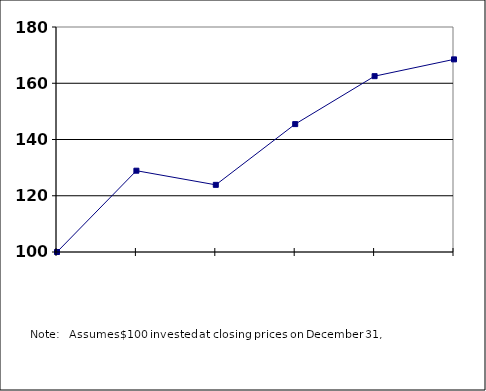
| Category |  100.00  |
|---|---|
| nan | 100 |
| 2014.0 | 128.91 |
| 2015.0 | 123.877 |
| 2016.0 | 145.476 |
| 2017.0 | 162.52 |
| 2018.0 | 168.491 |